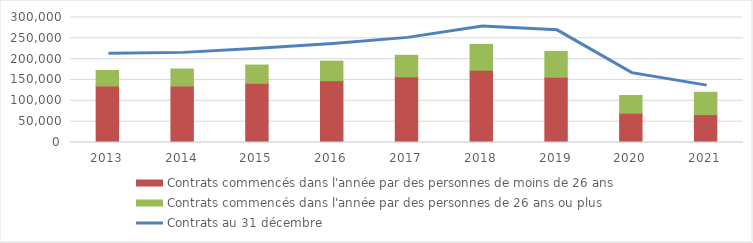
| Category | Contrats commencés dans l'année par des personnes de moins de 26 ans | Contrats commencés dans l'année par des personnes de 26 ans ou plus |
|---|---|---|
| 2013.0 | 135511 | 37311 |
| 2014.0 | 135511 | 40797 |
| 2015.0 | 142044 | 43835 |
| 2016.0 | 148293 | 47012 |
| 2017.0 | 157763 | 51514 |
| 2018.0 | 173441 | 61960 |
| 2019.0 | 156552 | 62145 |
| 2020.0 | 70388 | 42354 |
| 2021.0 | 66855 | 53707 |